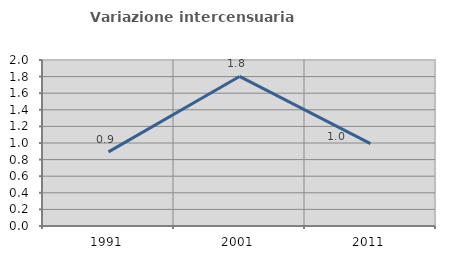
| Category | Variazione intercensuaria annua |
|---|---|
| 1991.0 | 0.894 |
| 2001.0 | 1.802 |
| 2011.0 | 0.991 |